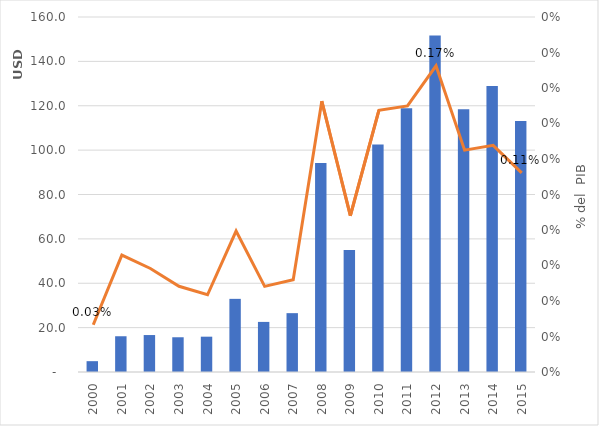
| Category | Gasto Sector Ambiente |
|---|---|
| 2000.0 | 4880727.501 |
| 2001.0 | 16113504.248 |
| 2002.0 | 16655526.395 |
| 2003.0 | 15657262.99 |
| 2004.0 | 15918336.14 |
| 2005.0 | 32968504.28 |
| 2006.0 | 22574313.61 |
| 2007.0 | 26521826.2 |
| 2008.0 | 94218945.37 |
| 2009.0 | 55039292.74 |
| 2010.0 | 102568315.25 |
| 2011.0 | 118840150.61 |
| 2012.0 | 151665161.5 |
| 2013.0 | 118467381.23 |
| 2014.0 | 128862314.86 |
| 2015.0 | 113128736.47 |